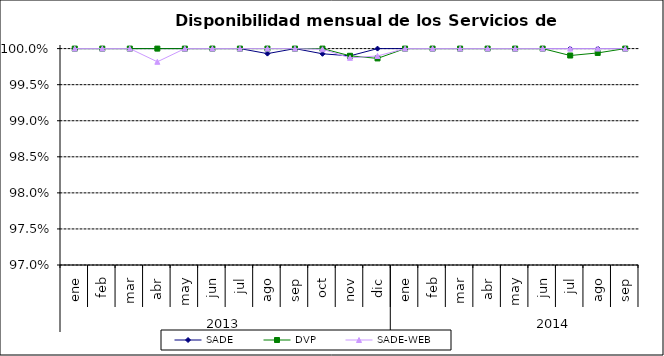
| Category | SADE | DVP | SADE-WEB |
|---|---|---|---|
| 0 | 1 | 1 | 1 |
| 1 | 1 | 1 | 1 |
| 2 | 1 | 1 | 1 |
| 3 | 1 | 1 | 0.998 |
| 4 | 1 | 1 | 1 |
| 5 | 1 | 1 | 1 |
| 6 | 1 | 1 | 1 |
| 7 | 0.999 | 1 | 1 |
| 8 | 1 | 1 | 1 |
| 9 | 0.999 | 1 | 1 |
| 10 | 0.999 | 0.999 | 0.999 |
| 11 | 1 | 0.999 | 0.999 |
| 12 | 1 | 1 | 1 |
| 13 | 1 | 1 | 1 |
| 14 | 1 | 1 | 1 |
| 15 | 1 | 1 | 1 |
| 16 | 1 | 1 | 1 |
| 17 | 1 | 1 | 1 |
| 18 | 1 | 0.999 | 1 |
| 19 | 1 | 0.999 | 1 |
| 20 | 1 | 1 | 1 |